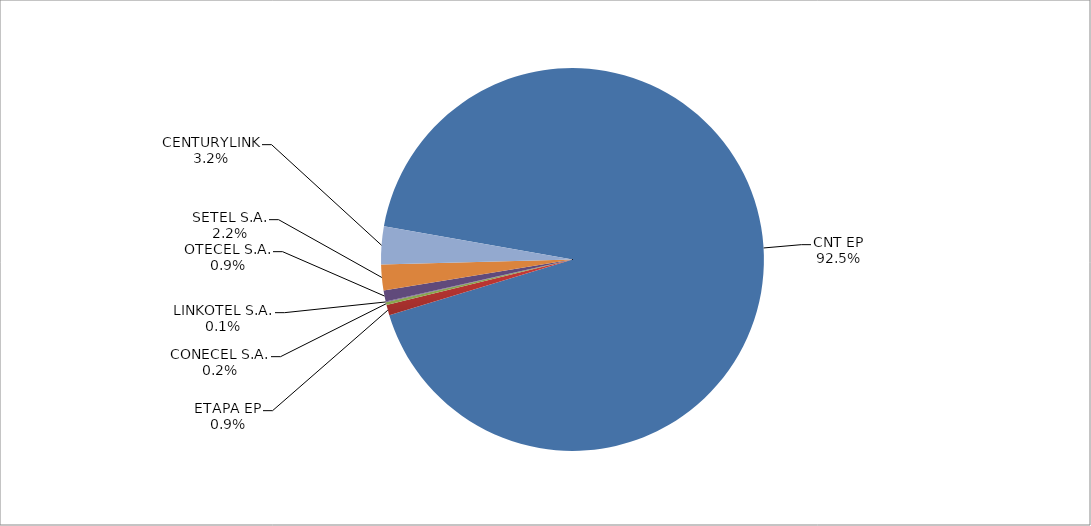
| Category | Series 0 |
|---|---|
| CNT EP | 2760 |
| ETAPA EP | 26 |
| CONECEL S.A. | 7 |
| LINKOTEL S.A. | 2 |
| OTECEL S.A. | 28 |
| SETEL S.A. | 65 |
| CENTURYLINK | 95 |